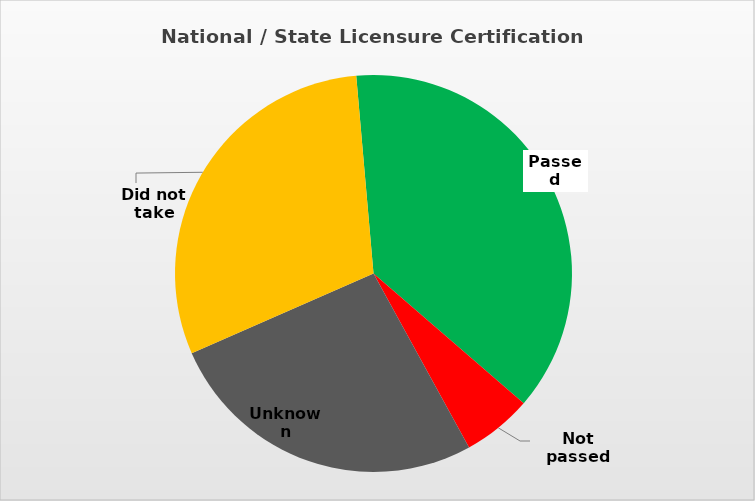
| Category | Series 0 |
|---|---|
| Passed | 0.377 |
| Not passed | 0.057 |
| Unknown | 0.264 |
| Did not take | 0.302 |